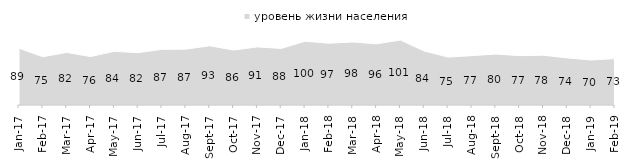
| Category | уровень жизни населения |
|---|---|
| 2017-01-01 | 88.55 |
| 2017-02-01 | 75.45 |
| 2017-03-01 | 82.1 |
| 2017-04-01 | 75.7 |
| 2017-05-01 | 83.85 |
| 2017-06-01 | 81.75 |
| 2017-07-01 | 86.95 |
| 2017-08-01 | 87.25 |
| 2017-09-01 | 92.5 |
| 2017-10-01 | 85.9 |
| 2017-11-01 | 90.75 |
| 2017-12-01 | 88.4 |
| 2018-01-01 | 99.6 |
| 2018-02-01 | 96.5 |
| 2018-03-01 | 98.45 |
| 2018-04-01 | 95.55 |
| 2018-05-01 | 101.45 |
| 2018-06-01 | 84.2 |
| 2018-07-01 | 74.9 |
| 2018-08-01 | 77.1 |
| 2018-09-01 | 79.6 |
| 2018-10-01 | 77.1 |
| 2018-11-01 | 77.745 |
| 2018-12-01 | 73.6 |
| 2019-01-01 | 70.25 |
| 2019-02-01 | 72.55 |